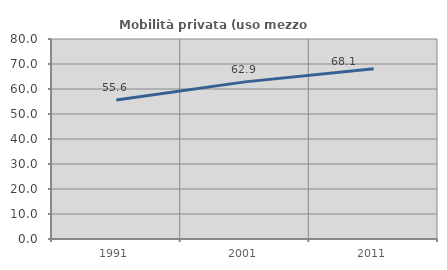
| Category | Mobilità privata (uso mezzo privato) |
|---|---|
| 1991.0 | 55.602 |
| 2001.0 | 62.85 |
| 2011.0 | 68.145 |